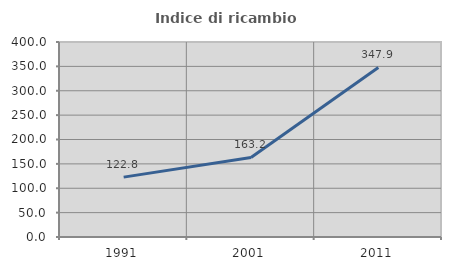
| Category | Indice di ricambio occupazionale  |
|---|---|
| 1991.0 | 122.838 |
| 2001.0 | 163.154 |
| 2011.0 | 347.887 |